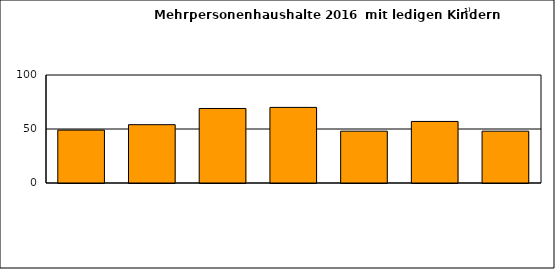
| Category | Series 0 |
|---|---|
| 0 | 49 |
| 1 | 54 |
| 2 | 69 |
| 3 | 70 |
| 4 | 48 |
| 5 | 57 |
| 6 | 48 |